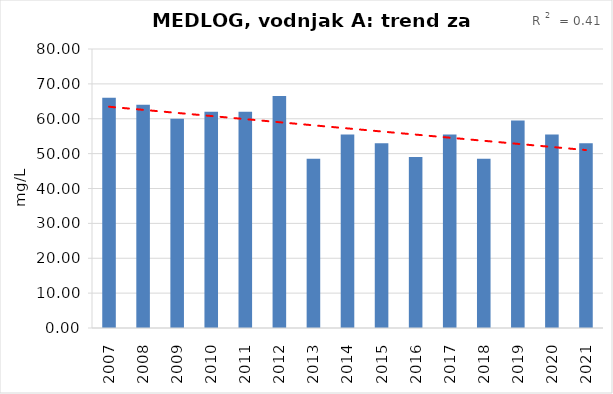
| Category | Vsota |
|---|---|
| 2007 | 66 |
| 2008 | 64 |
| 2009 | 60 |
| 2010 | 62 |
| 2011 | 62 |
| 2012 | 66.5 |
| 2013 | 48.5 |
| 2014 | 55.5 |
| 2015 | 53 |
| 2016 | 49 |
| 2017 | 55.5 |
| 2018 | 48.5 |
| 2019 | 59.5 |
| 2020 | 55.5 |
| 2021 | 53 |